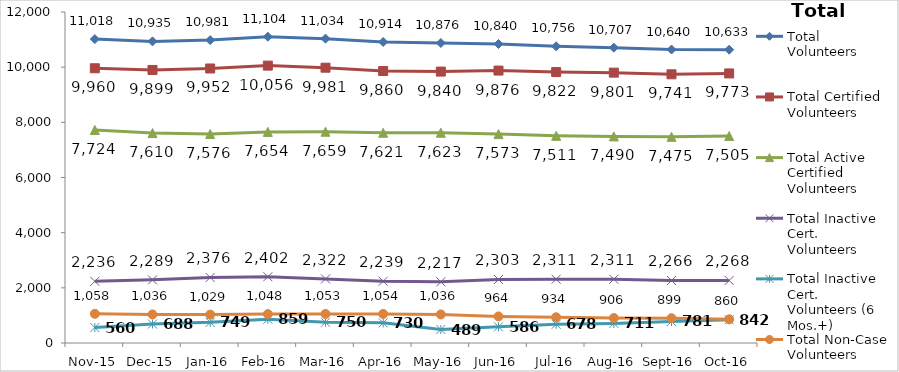
| Category | Total Volunteers | Total Certified Volunteers | Total Active Certified Volunteers | Total Inactive Cert. Volunteers | Total Inactive Cert. Volunteers (6 Mos.+) | Total Non-Case Volunteers |
|---|---|---|---|---|---|---|
| Nov-15 | 11018 | 9960 | 7724 | 2236 | 560 | 1058 |
| Dec-15 | 10935 | 9899 | 7610 | 2289 | 688 | 1036 |
| Jan-16 | 10981 | 9952 | 7576 | 2376 | 749 | 1029 |
| Feb-16 | 11104 | 10056 | 7654 | 2402 | 859 | 1048 |
| Mar-16 | 11034 | 9981 | 7659 | 2322 | 750 | 1053 |
| Apr-16 | 10914 | 9860 | 7621 | 2239 | 730 | 1054 |
| May-16 | 10876 | 9840 | 7623 | 2217 | 489 | 1036 |
| Jun-16 | 10840 | 9876 | 7573 | 2303 | 586 | 964 |
| Jul-16 | 10756 | 9822 | 7511 | 2311 | 678 | 934 |
| Aug-16 | 10707 | 9801 | 7490 | 2311 | 711 | 906 |
| Sep-16 | 10640 | 9741 | 7475 | 2266 | 781 | 899 |
| Oct-16 | 10633 | 9773 | 7505 | 2268 | 842 | 860 |